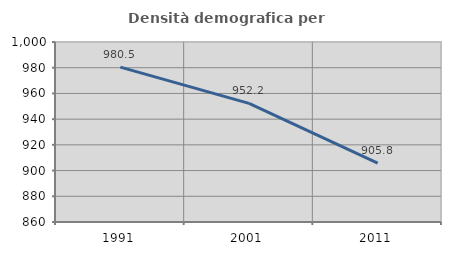
| Category | Densità demografica |
|---|---|
| 1991.0 | 980.492 |
| 2001.0 | 952.247 |
| 2011.0 | 905.758 |